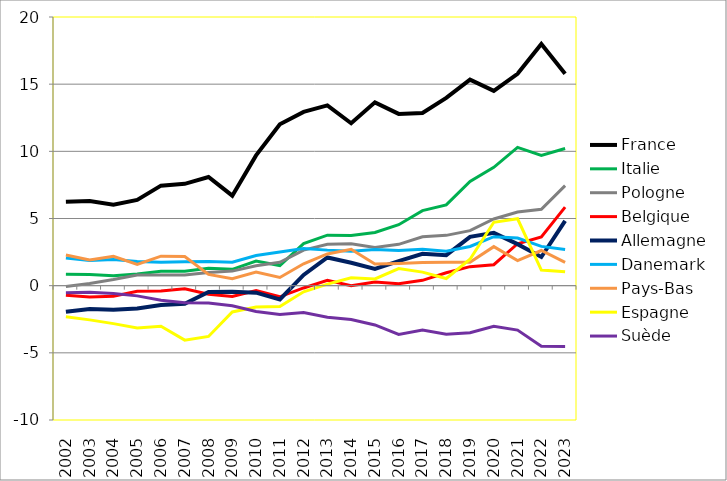
| Category | France | Italie | Pologne | Belgique | Allemagne | Danemark | Pays-Bas | Espagne | Suède |
|---|---|---|---|---|---|---|---|---|---|
| 2002 | 6.248 | 0.847 | -0.068 | -0.716 | -1.94 | 2.056 | 2.276 | -2.315 | -0.521 |
| 2003 | 6.3 | 0.829 | 0.166 | -0.846 | -1.73 | 1.872 | 1.92 | -2.545 | -0.498 |
| 2004 | 6.028 | 0.748 | 0.457 | -0.792 | -1.786 | 1.947 | 2.188 | -2.826 | -0.585 |
| 2005 | 6.385 | 0.873 | 0.797 | -0.424 | -1.697 | 1.804 | 1.589 | -3.145 | -0.76 |
| 2006 | 7.445 | 1.078 | 0.796 | -0.392 | -1.438 | 1.751 | 2.198 | -3.017 | -1.09 |
| 2007 | 7.579 | 1.076 | 0.794 | -0.227 | -1.348 | 1.776 | 2.174 | -4.055 | -1.268 |
| 2008 | 8.091 | 1.299 | 0.983 | -0.644 | -0.466 | 1.808 | 0.84 | -3.78 | -1.289 |
| 2009 | 6.698 | 1.218 | 1.085 | -0.809 | -0.46 | 1.74 | 0.517 | -1.955 | -1.496 |
| 2010 | 9.699 | 1.835 | 1.488 | -0.359 | -0.52 | 2.24 | 1.012 | -1.596 | -1.929 |
| 2011 | 12.018 | 1.494 | 1.741 | -0.829 | -1.021 | 2.51 | 0.606 | -1.557 | -2.138 |
| 2012 | 12.934 | 3.136 | 2.651 | -0.171 | 0.8 | 2.774 | 1.631 | -0.456 | -1.995 |
| 2013 | 13.42 | 3.756 | 3.079 | 0.396 | 2.099 | 2.646 | 2.364 | 0.111 | -2.352 |
| 2014 | 12.091 | 3.734 | 3.111 | -0.009 | 1.702 | 2.57 | 2.708 | 0.592 | -2.521 |
| 2015 | 13.645 | 3.964 | 2.843 | 0.266 | 1.252 | 2.689 | 1.615 | 0.502 | -2.924 |
| 2016 | 12.787 | 4.537 | 3.078 | 0.138 | 1.828 | 2.618 | 1.654 | 1.271 | -3.636 |
| 2017 | 12.86 | 5.586 | 3.641 | 0.396 | 2.374 | 2.705 | 1.728 | 1.008 | -3.305 |
| 2018 | 13.974 | 6.017 | 3.746 | 0.957 | 2.271 | 2.562 | 1.736 | 0.533 | -3.613 |
| 2019 | 15.34 | 7.752 | 4.097 | 1.415 | 3.633 | 2.917 | 1.746 | 1.966 | -3.504 |
| 2020 | 14.504 | 8.812 | 4.963 | 1.562 | 3.929 | 3.648 | 2.906 | 4.719 | -3.028 |
| 2021 | 15.767 | 10.292 | 5.48 | 3.122 | 3.09 | 3.541 | 1.866 | 4.981 | -3.306 |
| 2022 | 17.993 | 9.702 | 5.691 | 3.626 | 2.135 | 2.925 | 2.616 | 1.16 | -4.511 |
| 2023 | 15.771 | 10.206 | 7.447 | 5.844 | 4.82 | 2.692 | 1.74 | 1.03 | -4.52 |